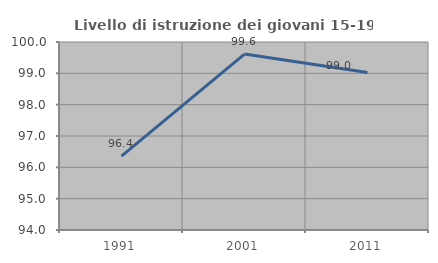
| Category | Livello di istruzione dei giovani 15-19 anni |
|---|---|
| 1991.0 | 96.359 |
| 2001.0 | 99.615 |
| 2011.0 | 99.026 |